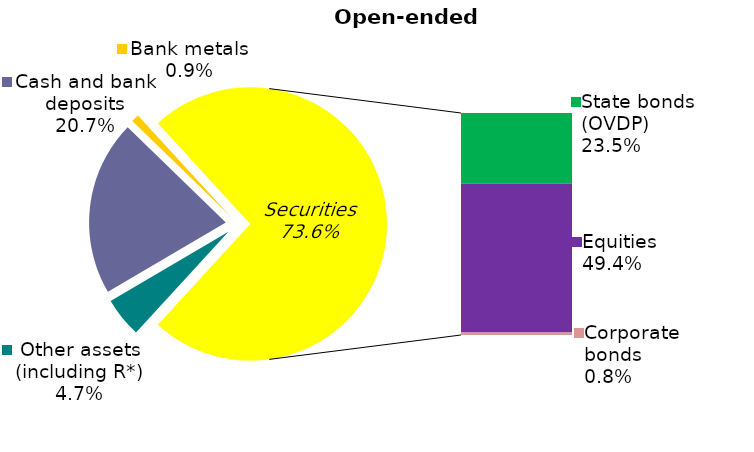
| Category | Series 0 |
|---|---|
| Other assets (including R*) | 0.047 |
| Cash and bank deposits | 0.207 |
| Bank metals | 0.009 |
| State bonds (OVDP) | 0.235 |
| Equities | 0.494 |
| Corporate bonds | 0.008 |